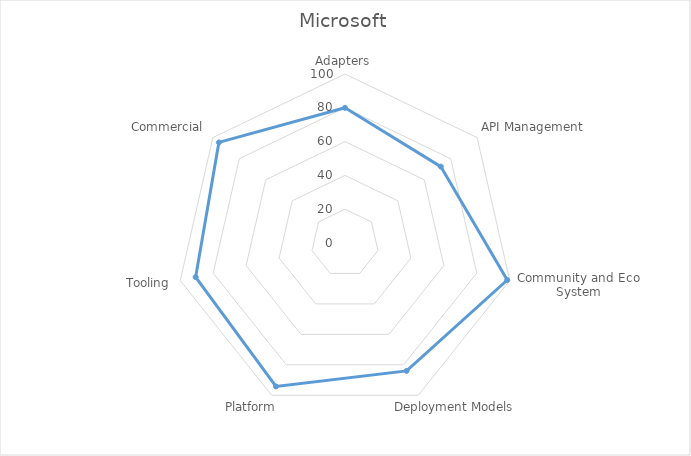
| Category | Total |
|---|---|
| Adapters | 80 |
| API Management | 72.5 |
| Community and Eco System | 98.462 |
| Deployment Models | 84 |
| Platform | 94.211 |
| Tooling | 90.645 |
| Commercial | 95.455 |